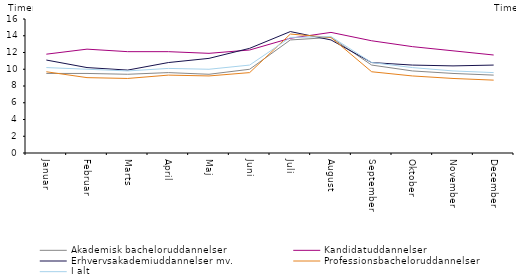
| Category | Akademisk bacheloruddannelser | Kandidatuddannelser | Erhvervsakademiuddannelser mv. | Professionsbacheloruddannelser | I alt |
|---|---|---|---|---|---|
| Januar | 9.5 | 11.8 | 11.1 | 9.7 | 10.2 |
| Februar | 9.5 | 12.4 | 10.2 | 9 | 10 |
| Marts | 9.4 | 12.1 | 9.9 | 8.9 | 9.8 |
| April | 9.6 | 12.1 | 10.8 | 9.3 | 10.1 |
| Maj | 9.4 | 11.9 | 11.3 | 9.2 | 10 |
| Juni | 10 | 12.3 | 12.5 | 9.6 | 10.5 |
| Juli | 13.5 | 13.7 | 14.5 | 14.2 | 13.8 |
| August | 13.8 | 14.4 | 13.5 | 13.8 | 13.9 |
| September | 10.5 | 13.4 | 10.8 | 9.7 | 10.8 |
| Oktober | 9.8 | 12.7 | 10.5 | 9.2 | 10.2 |
| November | 9.5 | 12.2 | 10.4 | 8.9 | 9.8 |
| December | 9.3 | 11.7 | 10.5 | 8.7 | 9.6 |